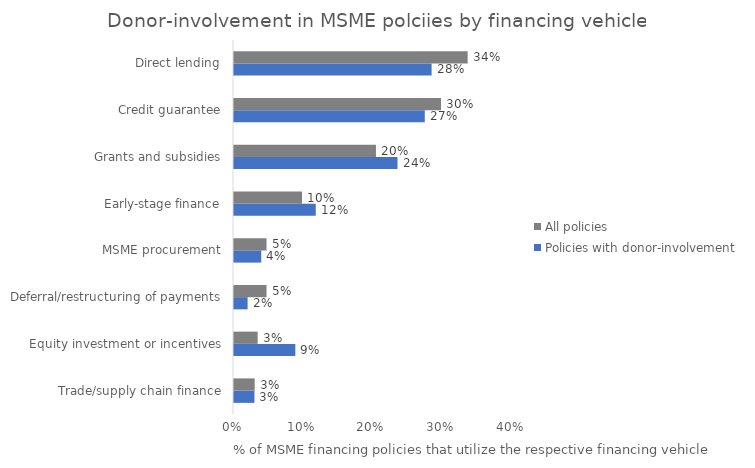
| Category | Policies with donor-involvement | All policies |
|---|---|---|
| Trade/supply chain finance | 0.029 | 0.03 |
| Equity investment or incentives | 0.088 | 0.034 |
| Deferral/restructuring of payments | 0.02 | 0.047 |
| MSME procurement | 0.039 | 0.047 |
| Early-stage finance | 0.118 | 0.098 |
| Grants and subsidies | 0.235 | 0.204 |
| Credit guarantee | 0.275 | 0.298 |
| Direct lending | 0.284 | 0.336 |